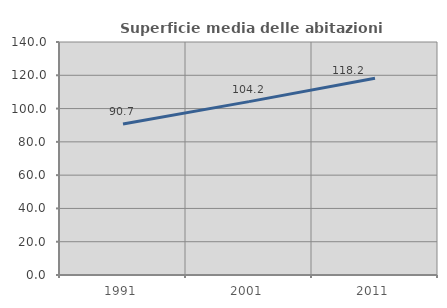
| Category | Superficie media delle abitazioni occupate |
|---|---|
| 1991.0 | 90.697 |
| 2001.0 | 104.182 |
| 2011.0 | 118.221 |